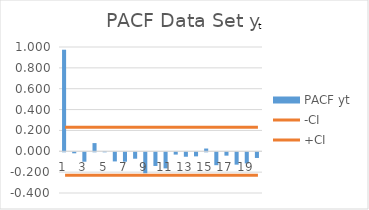
| Category | PACF yt |
|---|---|
| 0 | 0.974 |
| 1 | -0.01 |
| 2 | -0.091 |
| 3 | 0.079 |
| 4 | 0.001 |
| 5 | -0.088 |
| 6 | -0.09 |
| 7 | -0.062 |
| 8 | -0.201 |
| 9 | -0.131 |
| 10 | -0.154 |
| 11 | -0.022 |
| 12 | -0.043 |
| 13 | -0.039 |
| 14 | 0.026 |
| 15 | -0.124 |
| 16 | -0.032 |
| 17 | -0.119 |
| 18 | -0.107 |
| 19 | -0.054 |